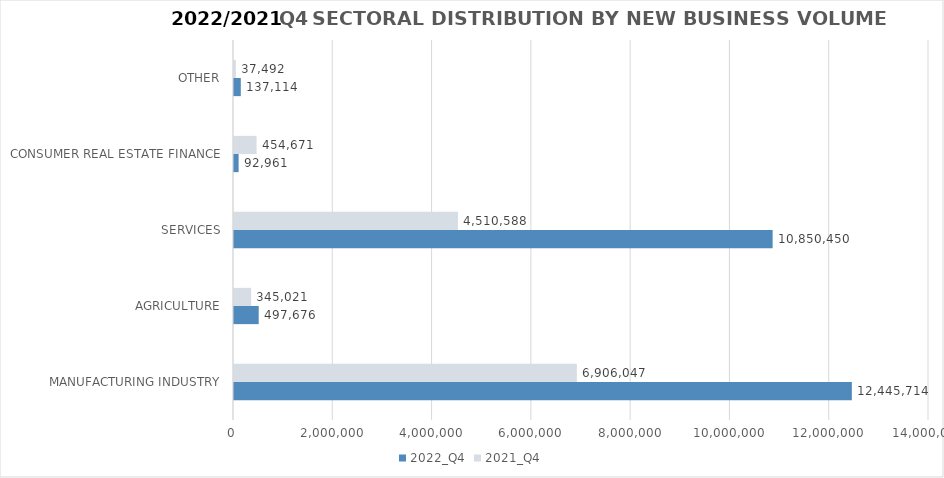
| Category | 2022_Q4 | 2021_Q4 |
|---|---|---|
| MANUFACTURING INDUSTRY | 12445714.012 | 6906047 |
| AGRICULTURE | 497676.166 | 345021 |
| SERVICES | 10850450.24 | 4510588 |
| CONSUMER REAL ESTATE FINANCE | 92961 | 454671 |
| OTHER | 137114 | 37492 |